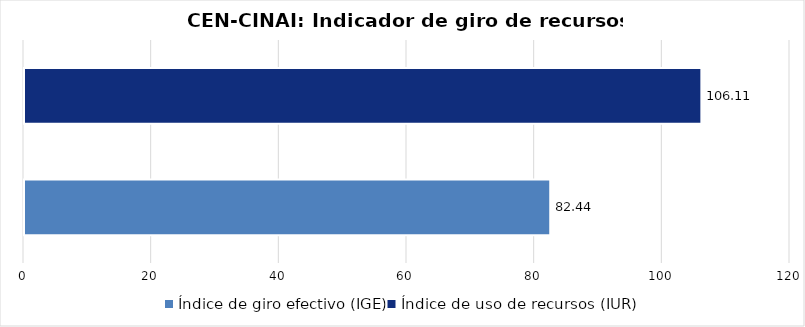
| Category | Series 0 |
|---|---|
| Índice de giro efectivo (IGE) | 82.44 |
| Índice de uso de recursos (IUR)  | 106.114 |